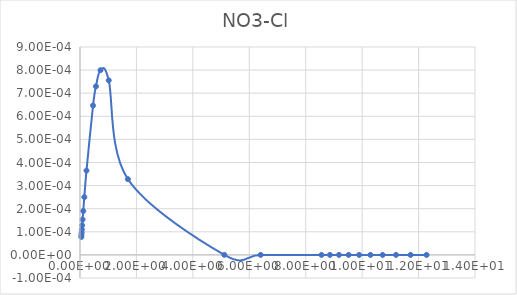
| Category | Series 0 |
|---|---|
| 0.045806 | 0 |
| 0.050896 | 0 |
| 0.057272 | 0 |
| 0.065473 | 0 |
| 0.076393 | 0 |
| 0.091717 | 0 |
| 0.11468 | 0 |
| 0.15308 | 0 |
| 0.22991 | 0 |
| 0.46246 | 0.001 |
| 0.56529 | 0.001 |
| 0.72693 | 0.001 |
| 1.018 | 0.001 |
| 1.6979 | 0 |
| 5.1148 | 0 |
| 6.4035 | 0 |
| 8.5602 | 0 |
| 8.8586 | 0 |
| 9.1785 | 0 |
| 9.5223 | 0 |
| 9.893 | 0 |
| 10.294 | 0 |
| 10.728 | 0 |
| 11.201 | 0 |
| 11.717 | 0 |
| 12.283 | 0 |